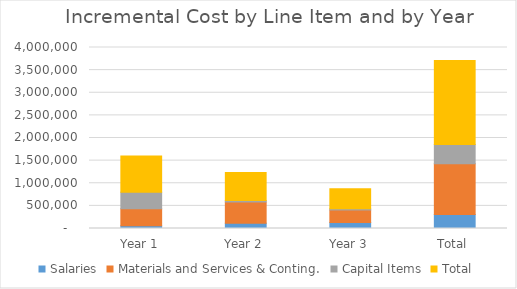
| Category | Salaries | Materials and Services & Conting. | Capital Items | Total |
|---|---|---|---|---|
| Year 1 | 61200 | 375590 | 364400 | 801190 |
| Year 2 | 115800 | 471285 | 30400 | 617485 |
| Year 3 | 132000 | 275925 | 30400 | 438325 |
| Total | 309000 | 1122800 | 425200 | 1857000 |